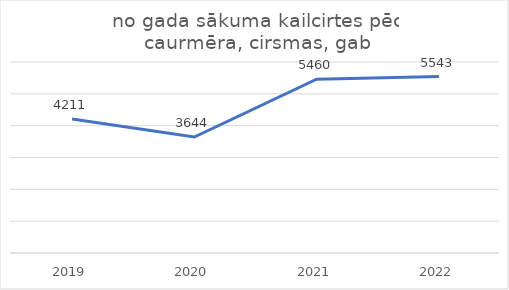
| Category | no gada sākuma kailcirtes pēc caurmēra, cirsmas, gab |
|---|---|
| 2019.0 | 4211 |
| 2020.0 | 3644 |
| 2021.0 | 5460 |
| 2022.0 | 5543 |